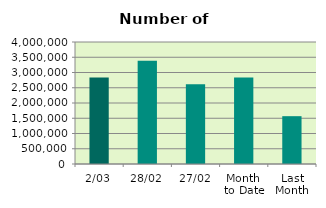
| Category | Series 0 |
|---|---|
| 2/03 | 2835404 |
| 28/02 | 3386342 |
| 27/02 | 2614134 |
| Month 
to Date | 2835404 |
| Last
Month | 1567888.4 |